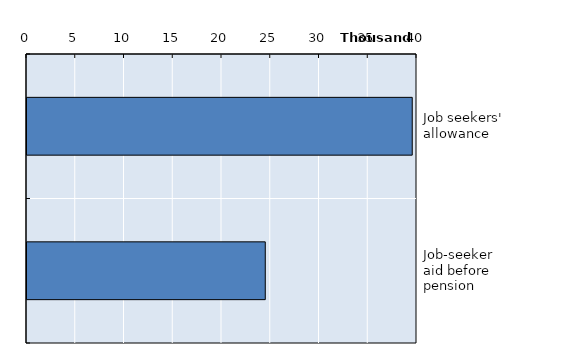
| Category | Series 0 |
|---|---|
| Job seekers' allowance | 39512 |
| Job-seeker aid before pension | 24439 |